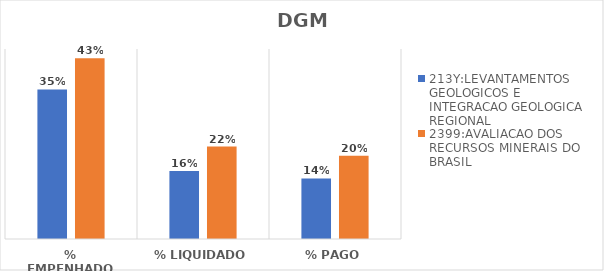
| Category | 213Y:LEVANTAMENTOS GEOLOGICOS E INTEGRACAO GEOLOGICA REGIONAL | 2399:AVALIACAO DOS RECURSOS MINERAIS DO BRASIL |
|---|---|---|
| % EMPENHADO | 0.354 | 0.428 |
| % LIQUIDADO | 0.161 | 0.219 |
| % PAGO | 0.143 | 0.197 |